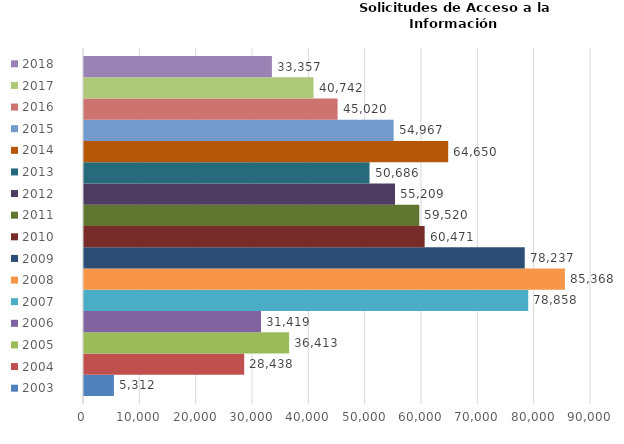
| Category | 2003 | 2004 | 2005 | 2006 | 2007 | 2008 | 2009 | 2010 | 2011 | 2012 | 2013 | 2014 | 2015 | 2016 | 2017 | 2018 |
|---|---|---|---|---|---|---|---|---|---|---|---|---|---|---|---|---|
| 0 | 5312 | 28438 | 36413 | 31419 | 78858 | 85368 | 78237 | 60471 | 59520 | 55209 | 50686 | 64650 | 54967 | 45020 | 40742 | 33357 |